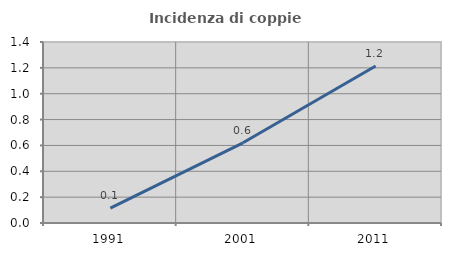
| Category | Incidenza di coppie miste |
|---|---|
| 1991.0 | 0.115 |
| 2001.0 | 0.62 |
| 2011.0 | 1.215 |